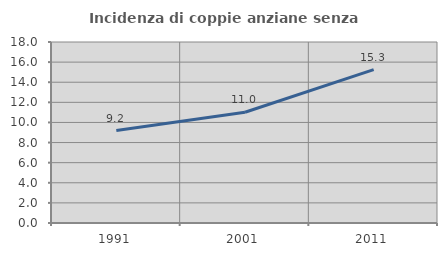
| Category | Incidenza di coppie anziane senza figli  |
|---|---|
| 1991.0 | 9.193 |
| 2001.0 | 11.015 |
| 2011.0 | 15.251 |